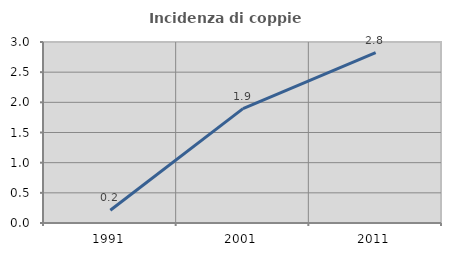
| Category | Incidenza di coppie miste |
|---|---|
| 1991.0 | 0.211 |
| 2001.0 | 1.896 |
| 2011.0 | 2.824 |